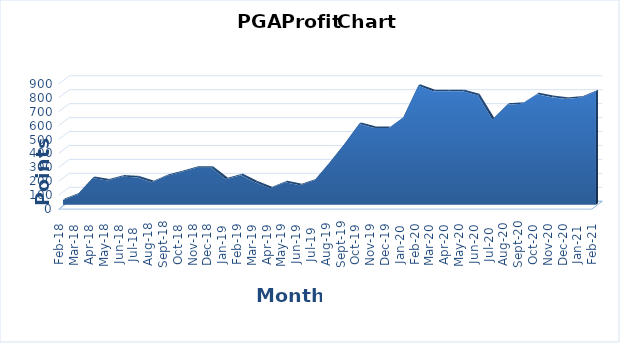
| Category | Series 0 |
|---|---|
| 2018-02-01 | 43.5 |
| 2018-03-01 | 85 |
| 2018-04-01 | 200.67 |
| 2018-05-01 | 182.79 |
| 2018-06-01 | 211.14 |
| 2018-07-01 | 204.92 |
| 2018-08-01 | 170.87 |
| 2018-09-01 | 216.51 |
| 2018-10-01 | 243.86 |
| 2018-11-01 | 274.13 |
| 2018-12-01 | 274.13 |
| 2019-01-01 | 191.98 |
| 2019-02-01 | 221.35 |
| 2019-03-01 | 168.6 |
| 2019-04-01 | 126.43 |
| 2019-05-01 | 170.64 |
| 2019-06-01 | 148.89 |
| 2019-07-01 | 184.52 |
| 2019-08-01 | 310.52 |
| 2019-09-01 | 443.84 |
| 2019-10-01 | 588.27 |
| 2019-11-01 | 560.02 |
| 2019-12-01 | 560.02 |
| 2020-01-01 | 639.02 |
| 2020-02-01 | 861.8 |
| 2020-03-01 | 822.8 |
| 2020-04-01 | 822.8 |
| 2020-05-01 | 822.8 |
| 2020-06-01 | 794 |
| 2020-07-01 | 619.9 |
| 2020-08-01 | 726.66 |
| 2020-09-01 | 733.36 |
| 2020-10-01 | 802.36 |
| 2020-11-01 | 780.94 |
| 2020-12-01 | 768.44 |
| 2021-01-01 | 777.94 |
| 2021-02-01 | 822.44 |